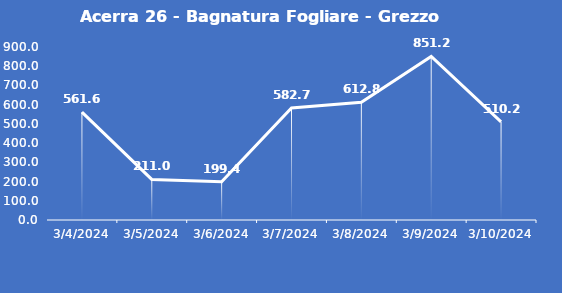
| Category | Acerra 26 - Bagnatura Fogliare - Grezzo (min) |
|---|---|
| 3/4/24 | 561.6 |
| 3/5/24 | 211 |
| 3/6/24 | 199.4 |
| 3/7/24 | 582.7 |
| 3/8/24 | 612.8 |
| 3/9/24 | 851.2 |
| 3/10/24 | 510.2 |